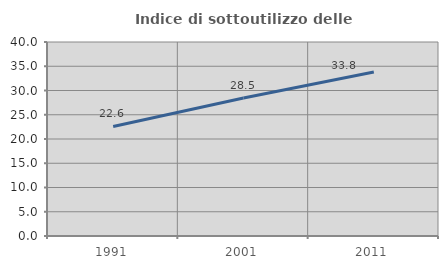
| Category | Indice di sottoutilizzo delle abitazioni  |
|---|---|
| 1991.0 | 22.591 |
| 2001.0 | 28.469 |
| 2011.0 | 33.808 |